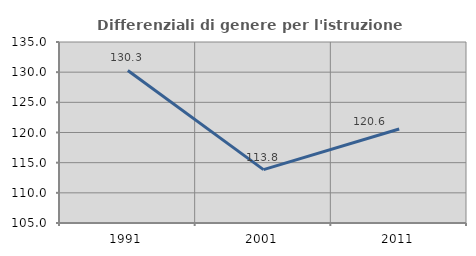
| Category | Differenziali di genere per l'istruzione superiore |
|---|---|
| 1991.0 | 130.29 |
| 2001.0 | 113.845 |
| 2011.0 | 120.585 |